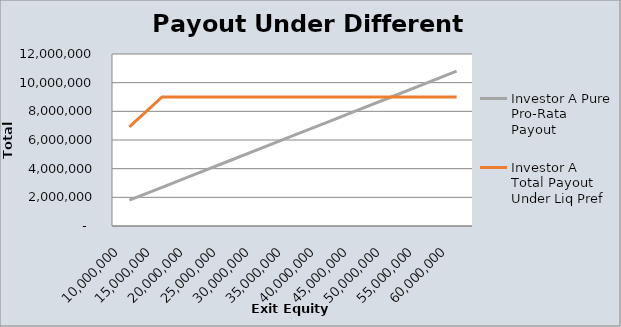
| Category | Investor A Pure Pro-Rata Payout | Investor A Total Payout Under Liq Pref |
|---|---|---|
| 10000000.0 | 1800000 | 6923076.923 |
| 15000000.0 | 2700000 | 9000000 |
| 20000000.0 | 3600000 | 9000000 |
| 25000000.0 | 4500000 | 9000000 |
| 30000000.0 | 5400000 | 9000000 |
| 35000000.0 | 6300000 | 9000000 |
| 40000000.0 | 7200000 | 9000000 |
| 45000000.0 | 8100000 | 9000000 |
| 50000000.0 | 9000000 | 9000000 |
| 55000000.0 | 9900000 | 9000000 |
| 60000000.0 | 10800000 | 9000000 |